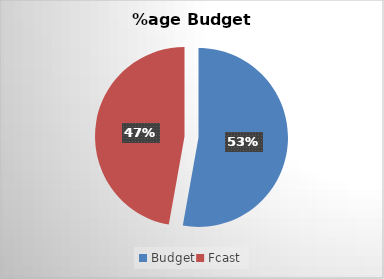
| Category | Series 0 |
|---|---|
| Budget | 1584.236 |
| Fcast | 1415.764 |